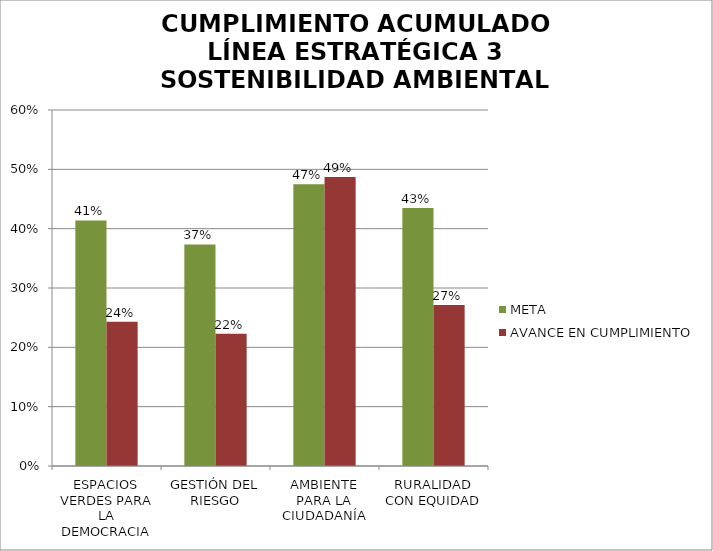
| Category | META | AVANCE EN CUMPLIMIENTO |
|---|---|---|
| ESPACIOS VERDES PARA LA DEMOCRACIA | 0.414 | 0.243 |
| GESTIÓN DEL RIESGO | 0.373 | 0.223 |
| AMBIENTE PARA LA CIUDADANÍA | 0.475 | 0.487 |
| RURALIDAD CON EQUIDAD | 0.435 | 0.271 |